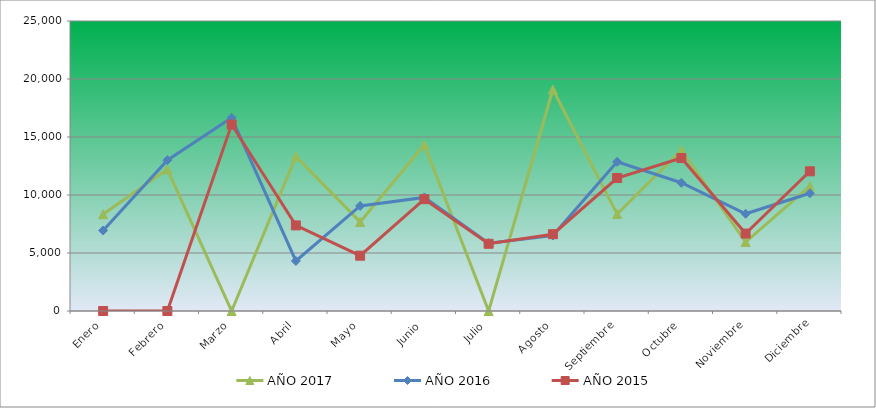
| Category | AÑO 2017 | AÑO 2016 | AÑO 2015 |
|---|---|---|---|
| Enero | 8343.747 | 6944.772 | 0 |
| Febrero | 12208.658 | 13005.32 | 0 |
| Marzo | 0 | 16654.967 | 16072.052 |
| Abril | 13333.634 | 4314.679 | 7380 |
| Mayo | 7680 | 9060.483 | 4769.198 |
| Junio | 14331.766 | 9790.452 | 9641.816 |
| Julio | 0 | 5848.469 | 5794.219 |
| Agosto | 19083.022 | 6510.855 | 6619.931 |
| Septiembre | 8360 | 12859.695 | 11462.815 |
| Octubre | 13866.053 | 11055.128 | 13186.992 |
| Noviembre | 5942.763 | 8380.266 | 6675.909 |
| Diciembre | 10757.751 | 10148.814 | 12043.928 |